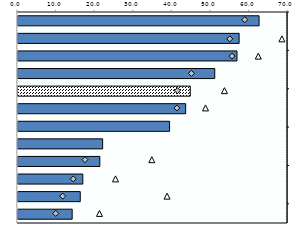
| Category | 25-64 |
|---|---|
| 0 | 62.5 |
| 1 | 57.327 |
| 2 | 56.772 |
| 3 | 51.006 |
| 4 | 44.673 |
| 5 | 43.472 |
| 6 | 39.29 |
| 7 | 21.94 |
| 8 | 21.214 |
| 9 | 16.8 |
| 10 | 16.142 |
| 11 | 14.047 |